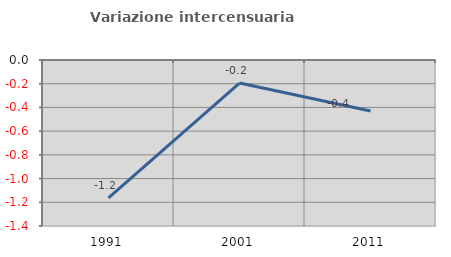
| Category | Variazione intercensuaria annua |
|---|---|
| 1991.0 | -1.162 |
| 2001.0 | -0.195 |
| 2011.0 | -0.43 |